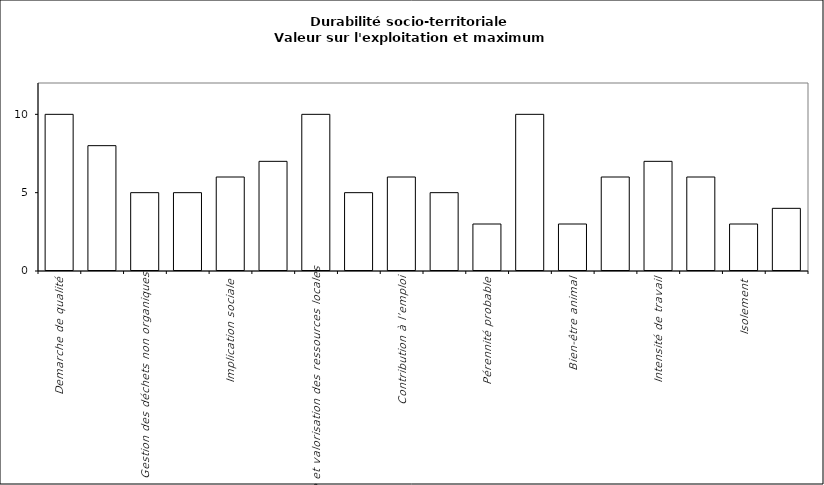
| Category | Valeur de l'exploitation agricole | Complément au maximum |
|---|---|---|
| Demarche de qualité | 0 | 10 |
| Valorisation du patrimoine bâti et du paysage | 0 | 8 |
| Gestion des déchets non organiques | 0 | 5 |
| Accessibilité de l’espace | 0 | 5 |
| Implication sociale | 0 | 6 |
| Valorisation par filières courtes | 0 | 7 |
| Autonomie et valorisation des ressources locales | 0 | 10 |
| Services, pluriactivité | 0 | 5 |
| Contribution à l’emploi | 0 | 6 |
| Travail collectif | 0 | 5 |
| Pérennité probable | 0 | 3 |
| Contribution à l’équilibre alimentaire mondial | 0 | 10 |
| Bien-être animal | 0 | 3 |
| Formation | 0 | 6 |
| Intensité de travail | 0 | 7 |
| Qualité de vie | 0 | 6 |
| Isolement | 0 | 3 |
| Accueil, hygiène et sécurité | 0 | 4 |